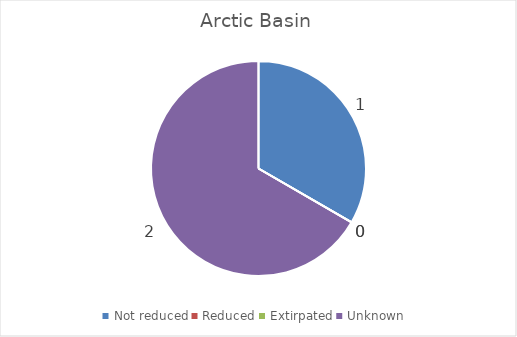
| Category | Arctic Basin |
|---|---|
| Not reduced | 1 |
| Reduced | 0 |
| Extirpated | 0 |
| Unknown | 2 |